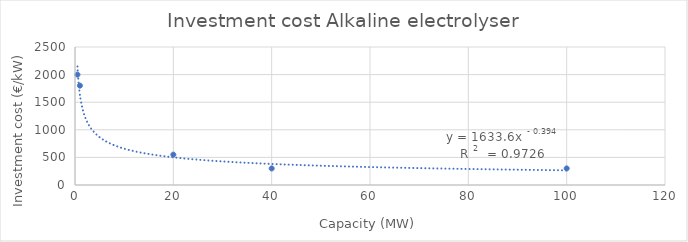
| Category | Series 0 |
|---|---|
| 0.5 | 2000 |
| 1.0 | 1800 |
| 20.0 | 550 |
| 40.0 | 300 |
| 100.0 | 300 |